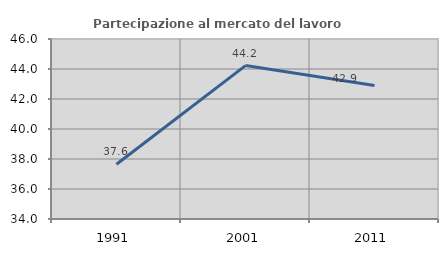
| Category | Partecipazione al mercato del lavoro  femminile |
|---|---|
| 1991.0 | 37.646 |
| 2001.0 | 44.227 |
| 2011.0 | 42.895 |